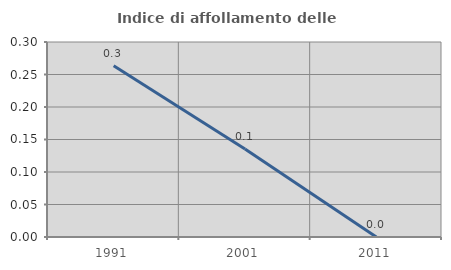
| Category | Indice di affollamento delle abitazioni  |
|---|---|
| 1991.0 | 0.264 |
| 2001.0 | 0.135 |
| 2011.0 | 0 |